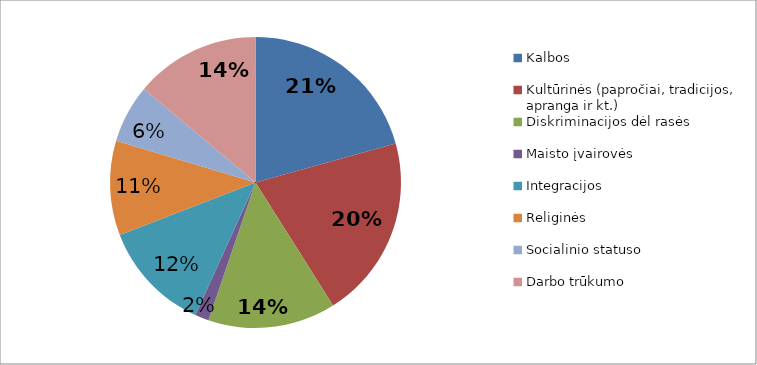
| Category | Series 0 |
|---|---|
| Kalbos | 67 |
| Kultūrinės (papročiai, tradicijos, apranga ir kt.) | 66 |
| Diskriminacijos dėl rasės | 46 |
| Maisto įvairovės | 5 |
| Integracijos | 40 |
| Religinės | 34 |
| Socialinio statuso | 21 |
| Darbo trūkumo | 45 |